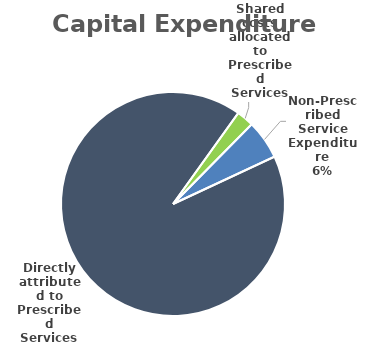
| Category | Series 0 |
|---|---|
| Directly attributed to Prescribed Services | 78.75 |
| Shared costs allocated to Prescribed Services | 2.137 |
| Non-Prescribed Service Expenditure | 4.851 |